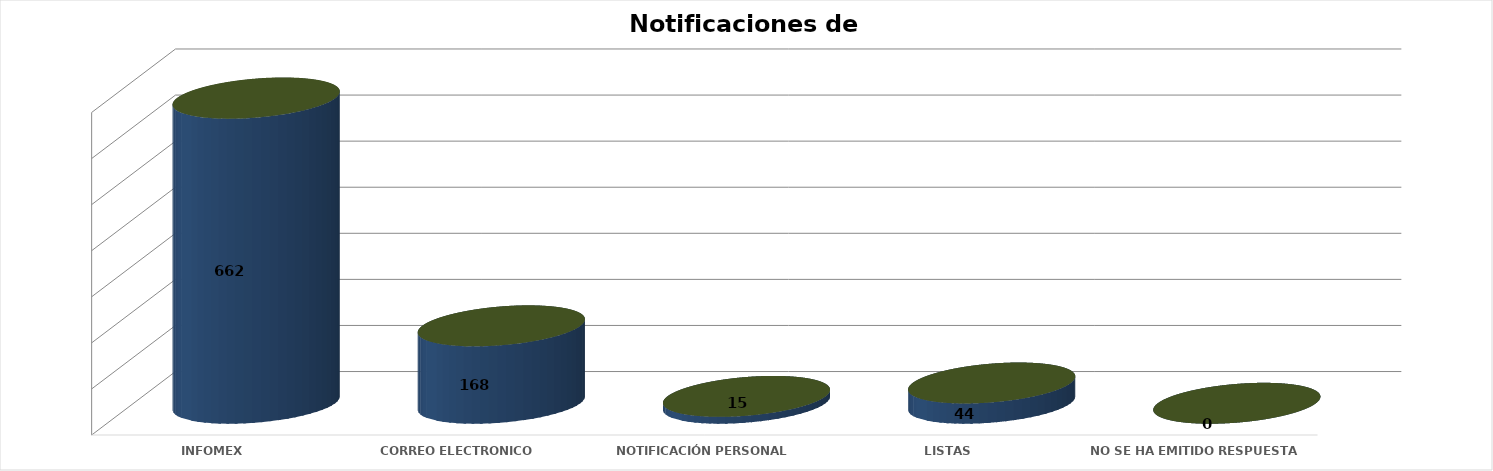
| Category | Series 0 | Series 1 | Series 2 | Series 3 | Series 4 |
|---|---|---|---|---|---|
| INFOMEX |  |  |  | 662 | 0.745 |
| CORREO ELECTRONICO |  |  |  | 168 | 0.189 |
| NOTIFICACIÓN PERSONAL |  |  |  | 15 | 0.017 |
| LISTAS |  |  |  | 44 | 0.049 |
|  NO SE HA EMITIDO RESPUESTA |  |  |  | 0 | 0 |